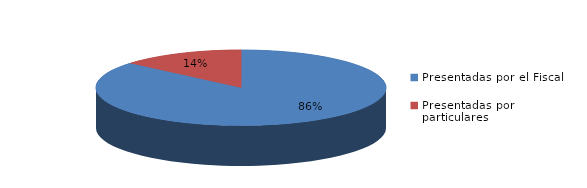
| Category | Series 0 |
|---|---|
| Presentadas por el Fiscal | 749 |
| Presentadas por particulares | 120 |